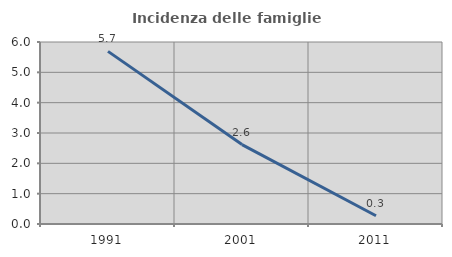
| Category | Incidenza delle famiglie numerose |
|---|---|
| 1991.0 | 5.691 |
| 2001.0 | 2.618 |
| 2011.0 | 0.271 |